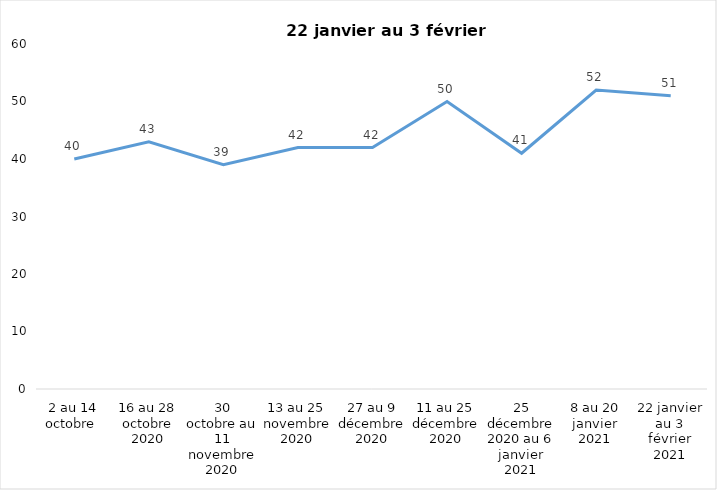
| Category | Toujours aux trois mesures |
|---|---|
| 2 au 14 octobre  | 40 |
| 16 au 28 octobre 2020 | 43 |
| 30 octobre au 11 novembre 2020 | 39 |
| 13 au 25 novembre 2020 | 42 |
| 27 au 9 décembre 2020 | 42 |
| 11 au 25 décembre 2020 | 50 |
| 25 décembre 2020 au 6 janvier 2021 | 41 |
| 8 au 20 janvier 2021 | 52 |
| 22 janvier au 3 février 2021 | 51 |